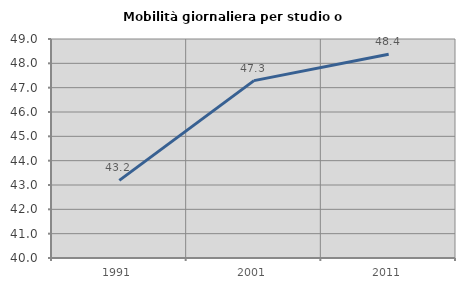
| Category | Mobilità giornaliera per studio o lavoro |
|---|---|
| 1991.0 | 43.191 |
| 2001.0 | 47.29 |
| 2011.0 | 48.371 |